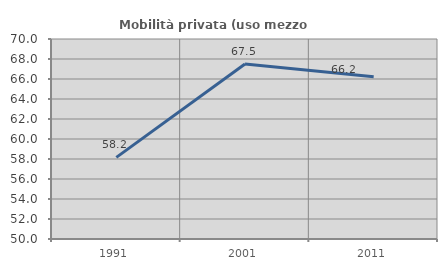
| Category | Mobilità privata (uso mezzo privato) |
|---|---|
| 1991.0 | 58.162 |
| 2001.0 | 67.507 |
| 2011.0 | 66.228 |